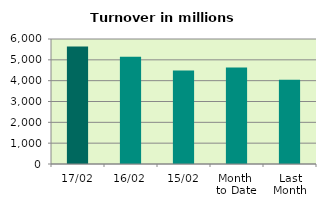
| Category | Series 0 |
|---|---|
| 17/02 | 5642.142 |
| 16/02 | 5146.712 |
| 15/02 | 4485.186 |
| Month 
to Date | 4632.627 |
| Last
Month | 4043.095 |